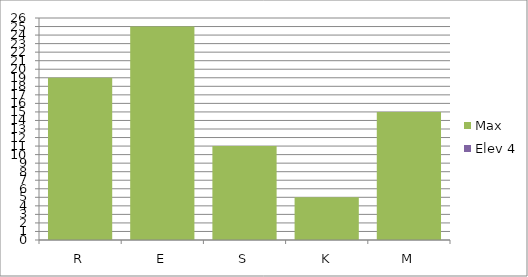
| Category | Max | Elev 4 |
|---|---|---|
| R | 19 | 0 |
| E | 25 | 0 |
| S | 11 | 0 |
| K | 5 | 0 |
| M | 15 | 0 |